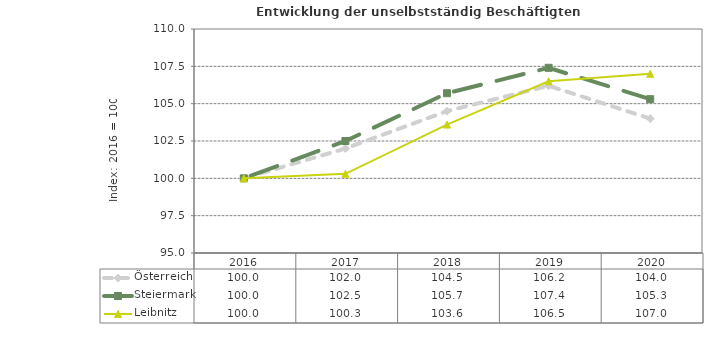
| Category | Österreich | Steiermark | Leibnitz |
|---|---|---|---|
| 2020.0 | 104 | 105.3 | 107 |
| 2019.0 | 106.2 | 107.4 | 106.5 |
| 2018.0 | 104.5 | 105.7 | 103.6 |
| 2017.0 | 102 | 102.5 | 100.3 |
| 2016.0 | 100 | 100 | 100 |